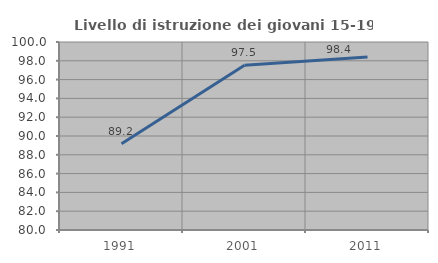
| Category | Livello di istruzione dei giovani 15-19 anni |
|---|---|
| 1991.0 | 89.175 |
| 2001.0 | 97.516 |
| 2011.0 | 98.413 |